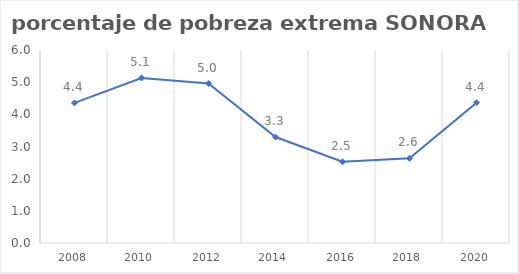
| Category | Series 0 |
|---|---|
| 2008.0 | 4.355 |
| 2010.0 | 5.131 |
| 2012.0 | 4.958 |
| 2014.0 | 3.294 |
| 2016.0 | 2.524 |
| 2018.0 | 2.633 |
| 2020.0 | 4.363 |